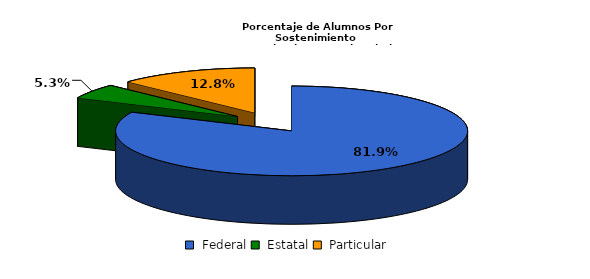
| Category | Series 0 |
|---|---|
|  Federal | 18707 |
|  Estatal | 1220 |
|  Particular | 2927 |